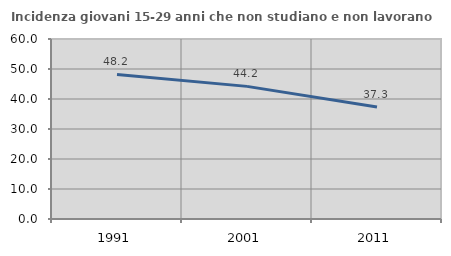
| Category | Incidenza giovani 15-29 anni che non studiano e non lavorano  |
|---|---|
| 1991.0 | 48.182 |
| 2001.0 | 44.208 |
| 2011.0 | 37.3 |